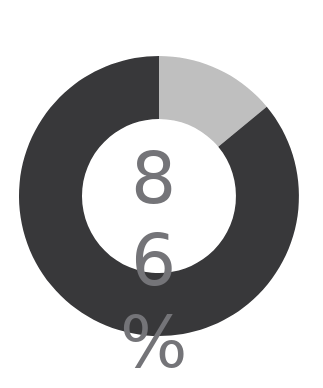
| Category | Series 0 |
|---|---|
| 0 | 0.14 |
| 1 | 0.86 |